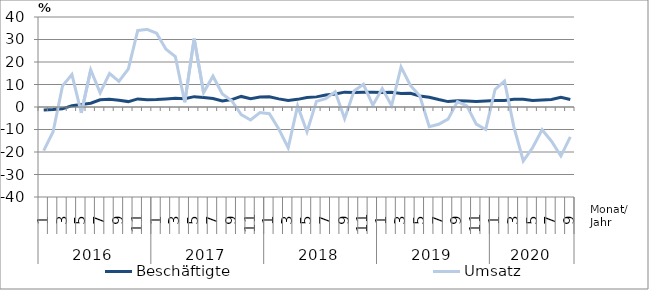
| Category | Beschäftigte | Umsatz |
|---|---|---|
| 0 | -1.3 | -19.4 |
| 1 | -1.1 | -11 |
| 2 | -0.8 | 9.4 |
| 3 | 0.6 | 14.4 |
| 4 | 1.1 | -2.6 |
| 5 | 1.7 | 16.5 |
| 6 | 3.2 | 6.3 |
| 7 | 3.4 | 14.9 |
| 8 | 3 | 11.4 |
| 9 | 2.4 | 16.9 |
| 10 | 3.6 | 34 |
| 11 | 3.2 | 34.5 |
| 12 | 3.3 | 32.8 |
| 13 | 3.6 | 25.7 |
| 14 | 3.9 | 22.4 |
| 15 | 3.7 | 2.1 |
| 16 | 4.6 | 30.4 |
| 17 | 4.2 | 6.4 |
| 18 | 3.8 | 13.7 |
| 19 | 2.7 | 5.8 |
| 20 | 3.3 | 2.8 |
| 21 | 4.7 | -3.4 |
| 22 | 3.7 | -5.8 |
| 23 | 4.4 | -2.5 |
| 24 | 4.5 | -3 |
| 25 | 3.6 | -9.8 |
| 26 | 2.9 | -18.1 |
| 27 | 3.4 | 0.5 |
| 28 | 4.2 | -11 |
| 29 | 4.5 | 2.5 |
| 30 | 5.3 | 3.7 |
| 31 | 5.8 | 6.8 |
| 32 | 6.6 | -5.2 |
| 33 | 6.5 | 7.1 |
| 34 | 6.6 | 10.1 |
| 35 | 6.6 | 0.8 |
| 36 | 6.4 | 8.2 |
| 37 | 6.5 | 0.6 |
| 38 | 6 | 17.8 |
| 39 | 6.1 | 9.6 |
| 40 | 4.9 | 4.9 |
| 41 | 4.3 | -8.8 |
| 42 | 3.3 | -7.7 |
| 43 | 2.4 | -5.4 |
| 44 | 2.8 | 2.4 |
| 45 | 2.7 | 0.5 |
| 46 | 2.5 | -7.6 |
| 47 | 2.7 | -10 |
| 48 | 2.9 | 7.8 |
| 49 | 2.9 | 11.5 |
| 50 | 3.4 | -8.8 |
| 51 | 3.4 | -24 |
| 52 | 2.9 | -18 |
| 53 | 3.1 | -10.1 |
| 54 | 3.3 | -15.2 |
| 55 | 4.3 | -21.8 |
| 56 | 3.3 | -13.3 |